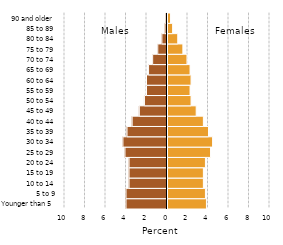
| Category | Female |
|---|---|
| Younger than 5 | 3.8 |
| 5 to 9 | 3.7 |
| 10 to 14 | 3.5 |
| 15 to 19 | 3.5 |
| 20 to 24 | 3.7 |
| 25 to 29 | 4.2 |
| 30 to 34 | 4.4 |
| 35 to 39 | 4 |
| 40 to 44 | 3.5 |
| 45 to 49 | 2.8 |
| 50 to 54 | 2.3 |
| 55 to 59 | 2.2 |
| 60 to 64 | 2.3 |
| 65 to 69 | 2.2 |
| 70 to 74 | 1.9 |
| 75 to 79 | 1.5 |
| 80 to 84 | 1 |
| 85 to 89 | 0.5 |
| 90 and older | 0.3 |